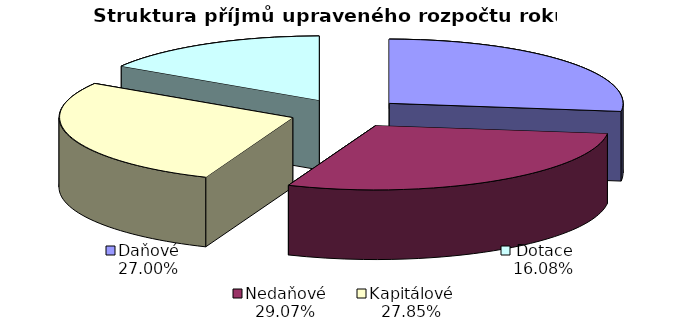
| Category | Upravený rozpočet |
|---|---|
| Daňové | 92121 |
| Nedaňové | 99183 |
| Kapitálové | 95008 |
| Dotace | 54852 |